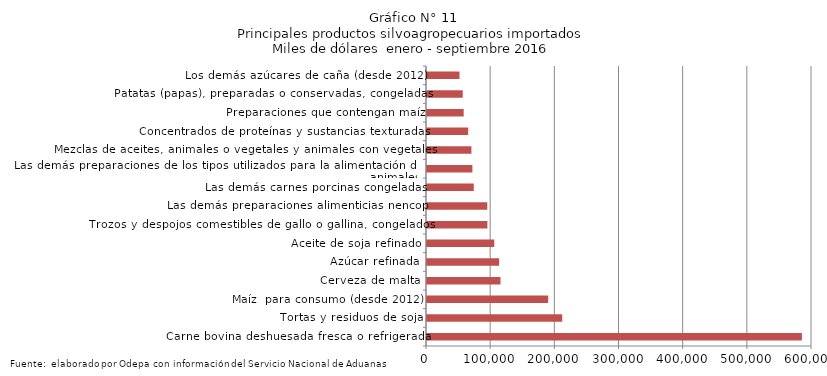
| Category | Series 0 |
|---|---|
| Carne bovina deshuesada fresca o refrigerada | 584241.781 |
| Tortas y residuos de soja | 210745.232 |
| Maíz  para consumo (desde 2012) | 188868.837 |
| Cerveza de malta | 114523.04 |
| Azúcar refinada | 112370.818 |
| Aceite de soja refinado | 104818.321 |
| Trozos y despojos comestibles de gallo o gallina, congelados | 94103.395 |
| Las demás preparaciones alimenticias nencop | 93956.839 |
| Las demás carnes porcinas congeladas | 72931.795 |
| Las demás preparaciones de los tipos utilizados para la alimentación de los animales | 70746.001 |
| Mezclas de aceites, animales o vegetales y animales con vegetales | 69200.631 |
| Concentrados de proteínas y sustancias texturadas | 64190.056 |
| Preparaciones que contengan maíz | 57182.84 |
| Patatas (papas), preparadas o conservadas, congeladas | 55701.61 |
| Los demás azúcares de caña (desde 2012) | 50683.124 |